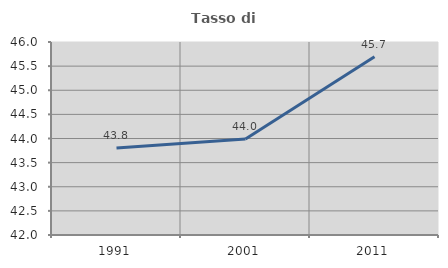
| Category | Tasso di occupazione   |
|---|---|
| 1991.0 | 43.803 |
| 2001.0 | 43.992 |
| 2011.0 | 45.694 |